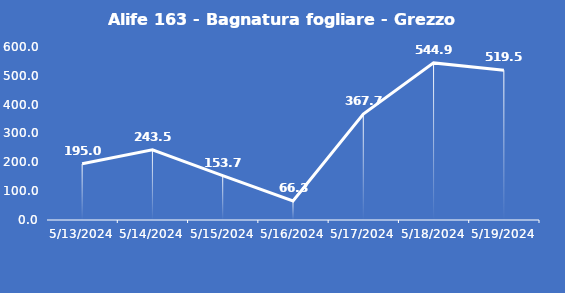
| Category | Alife 163 - Bagnatura fogliare - Grezzo (min) |
|---|---|
| 5/13/24 | 195 |
| 5/14/24 | 243.5 |
| 5/15/24 | 153.7 |
| 5/16/24 | 66.3 |
| 5/17/24 | 367.7 |
| 5/18/24 | 544.9 |
| 5/19/24 | 519.5 |